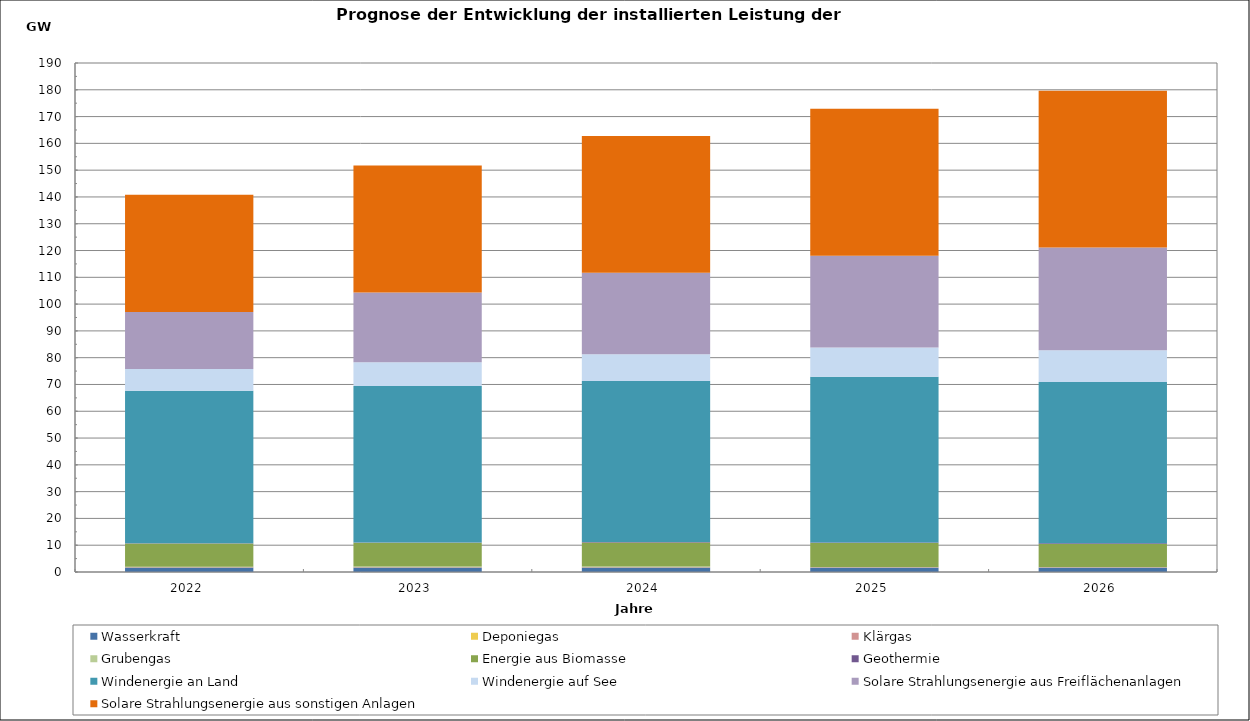
| Category | Wasserkraft | Deponiegas | Klärgas | Grubengas | Energie aus Biomasse | Geothermie | Windenergie an Land | Windenergie auf See | Solare Strahlungsenergie aus Freiflächenanlagen | Solare Strahlungsenergie aus sonstigen Anlagen |
|---|---|---|---|---|---|---|---|---|---|---|
| 2022.0 | 1643.781 | 98.599 | 80.402 | 181.024 | 8640.344 | 90.315 | 56890.825 | 8116.218 | 21328.314 | 43772.786 |
| 2023.0 | 1651.347 | 97.402 | 80.968 | 181.024 | 8878.522 | 124.065 | 58454.644 | 8865.218 | 26009.279 | 47399.594 |
| 2024.0 | 1658.914 | 94.221 | 81.534 | 181.024 | 9031.963 | 161.565 | 60077.931 | 9991.218 | 30396.405 | 51112.641 |
| 2025.0 | 1666.481 | 87.072 | 82.1 | 12.725 | 8968.985 | 202.815 | 61884.482 | 10891.218 | 34266.917 | 54876.698 |
| 2026.0 | 1674.047 | 86.165 | 82.667 | 7.237 | 8646.758 | 247.815 | 60223.548 | 11849.218 | 38272.391 | 58517.84 |